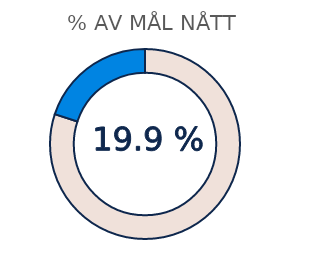
| Category | Series 1 |
|---|---|
| 0 | 0.801 |
| 1 | 0.199 |